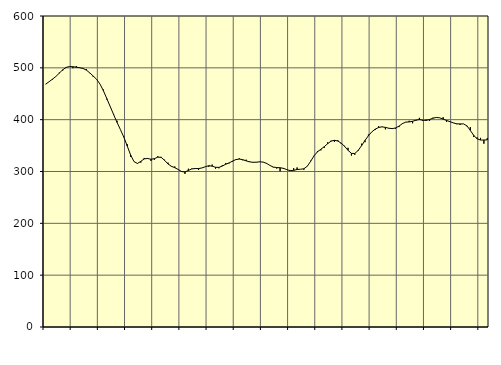
| Category | Piggar | Series 1 |
|---|---|---|
| nan | 468.3 | 468.64 |
| 87.0 | 473.2 | 473.27 |
| 87.0 | 477.1 | 478.19 |
| 87.0 | 483.4 | 483.36 |
| nan | 490.8 | 489.68 |
| 88.0 | 494.7 | 496.19 |
| 88.0 | 501.2 | 500.78 |
| 88.0 | 502.7 | 502.53 |
| nan | 499.3 | 502.12 |
| 89.0 | 503.5 | 501.16 |
| 89.0 | 499.8 | 500.27 |
| 89.0 | 499.3 | 498.77 |
| nan | 497.6 | 495.47 |
| 90.0 | 489.7 | 490.11 |
| 90.0 | 482.4 | 484.08 |
| 90.0 | 477.3 | 477.71 |
| nan | 468.5 | 468.56 |
| 91.0 | 458 | 455.62 |
| 91.0 | 438.8 | 440.61 |
| 91.0 | 425.5 | 425.21 |
| nan | 411 | 409.83 |
| 92.0 | 397.8 | 394.76 |
| 92.0 | 380.7 | 380.79 |
| 92.0 | 367.4 | 366.3 |
| nan | 352.6 | 349.25 |
| 93.0 | 328.4 | 331.86 |
| 93.0 | 319 | 319.08 |
| 93.0 | 314.9 | 315.53 |
| nan | 317.2 | 319.54 |
| 94.0 | 326.1 | 324.34 |
| 94.0 | 326.1 | 325.11 |
| 94.0 | 320.3 | 323.64 |
| nan | 322.6 | 324.79 |
| 95.0 | 329.4 | 327.69 |
| 95.0 | 328.2 | 327.28 |
| 95.0 | 322.7 | 321.52 |
| nan | 317.1 | 314.54 |
| 96.0 | 309.4 | 310.06 |
| 96.0 | 309.7 | 307.35 |
| 96.0 | 304.1 | 303.87 |
| nan | 300.6 | 299.99 |
| 97.0 | 295.4 | 299.1 |
| 97.0 | 305.3 | 301.93 |
| 97.0 | 305.7 | 304.98 |
| nan | 306.2 | 305.72 |
| 98.0 | 302.9 | 305.65 |
| 98.0 | 307 | 306.85 |
| 98.0 | 309.4 | 309.2 |
| nan | 309 | 311.21 |
| 99.0 | 313.3 | 310.31 |
| 99.0 | 305.6 | 308.15 |
| 99.0 | 306.2 | 307.92 |
| nan | 312.2 | 310.54 |
| 0.0 | 316.4 | 313.99 |
| 0.0 | 315.7 | 316.63 |
| 0.0 | 318.9 | 320.03 |
| nan | 323.8 | 323.02 |
| 1.0 | 325.5 | 323.99 |
| 1.0 | 321.6 | 322.84 |
| 1.0 | 322.8 | 320.55 |
| nan | 319.3 | 318.61 |
| 2.0 | 318.2 | 317.76 |
| 2.0 | 317.4 | 317.99 |
| 2.0 | 319.2 | 318.65 |
| nan | 318.4 | 318.16 |
| 3.0 | 315 | 315.73 |
| 3.0 | 311.8 | 311.75 |
| 3.0 | 308 | 308.57 |
| nan | 305.7 | 307.58 |
| 4.0 | 300.3 | 307.25 |
| 4.0 | 304.8 | 306.07 |
| 4.0 | 303.2 | 303.57 |
| nan | 302.6 | 301.65 |
| 5.0 | 306.5 | 302.21 |
| 5.0 | 307.8 | 303.84 |
| 5.0 | 304.4 | 304.35 |
| nan | 303.3 | 305.25 |
| 6.0 | 309.8 | 310.14 |
| 6.0 | 320.8 | 319.67 |
| 6.0 | 330.7 | 330.3 |
| nan | 339.5 | 337.97 |
| 7.0 | 340.7 | 342.98 |
| 7.0 | 345.6 | 347.82 |
| 7.0 | 356.2 | 353.62 |
| nan | 359.4 | 358.57 |
| 8.0 | 356.9 | 360.25 |
| 8.0 | 360.4 | 358.8 |
| 8.0 | 353 | 354.66 |
| nan | 349.6 | 348.44 |
| 9.0 | 345.7 | 340.89 |
| 9.0 | 330.8 | 334.98 |
| 9.0 | 332.3 | 334.72 |
| nan | 339.6 | 340.75 |
| 10.0 | 353.7 | 350.02 |
| 10.0 | 356.6 | 359.98 |
| 10.0 | 371.2 | 368.95 |
| nan | 376.6 | 376.46 |
| 11.0 | 380 | 381.64 |
| 11.0 | 387.4 | 384.91 |
| 11.0 | 385.9 | 386.21 |
| nan | 381.3 | 385.11 |
| 12.0 | 383 | 383.48 |
| 12.0 | 383.7 | 382.77 |
| 12.0 | 382.6 | 383.99 |
| nan | 385.7 | 387.49 |
| 13.0 | 393.1 | 392.34 |
| 13.0 | 395.6 | 395.27 |
| 13.0 | 397.8 | 395.64 |
| nan | 393 | 396.81 |
| 14.0 | 397.9 | 399.08 |
| 14.0 | 403.5 | 400.08 |
| 14.0 | 397.5 | 399.01 |
| nan | 400.2 | 398.5 |
| 15.0 | 397.5 | 400.33 |
| 15.0 | 403.7 | 402.81 |
| 15.0 | 403.9 | 404.26 |
| nan | 403.5 | 403.55 |
| 16.0 | 404.7 | 401.07 |
| 16.0 | 395.9 | 398.48 |
| 16.0 | 395.5 | 396.12 |
| nan | 393.5 | 393.72 |
| 17.0 | 391.3 | 392.01 |
| 17.0 | 389.7 | 391.78 |
| 17.0 | 392 | 391.83 |
| nan | 387.3 | 388.11 |
| 18.0 | 385.6 | 379.3 |
| 18.0 | 366.5 | 369.65 |
| 18.0 | 365.7 | 363.13 |
| nan | 364.9 | 360.71 |
| 19.0 | 353.6 | 360.7 |
| 19.0 | 364.5 | 361.08 |